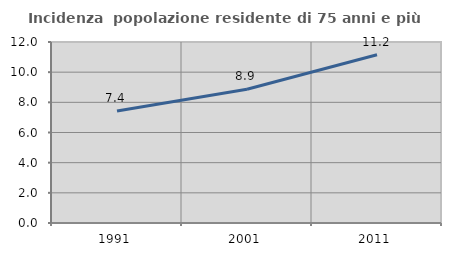
| Category | Incidenza  popolazione residente di 75 anni e più |
|---|---|
| 1991.0 | 7.431 |
| 2001.0 | 8.863 |
| 2011.0 | 11.151 |